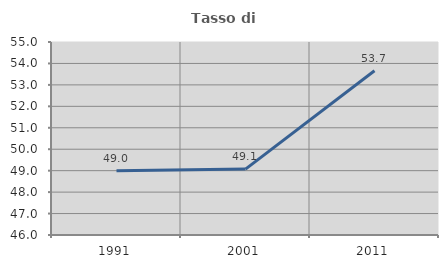
| Category | Tasso di occupazione   |
|---|---|
| 1991.0 | 48.994 |
| 2001.0 | 49.073 |
| 2011.0 | 53.658 |